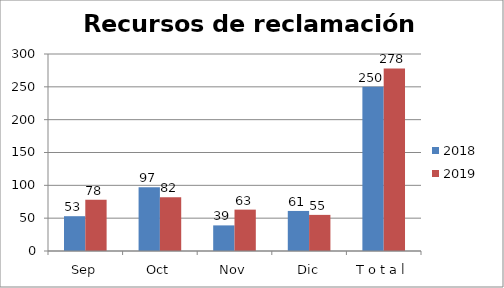
| Category | 2018 | 2019 |
|---|---|---|
| Sep | 53 | 78 |
| Oct | 97 | 82 |
| Nov | 39 | 63 |
| Dic | 61 | 55 |
| T o t a l | 250 | 278 |